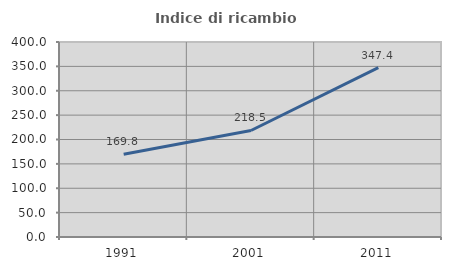
| Category | Indice di ricambio occupazionale  |
|---|---|
| 1991.0 | 169.811 |
| 2001.0 | 218.519 |
| 2011.0 | 347.368 |